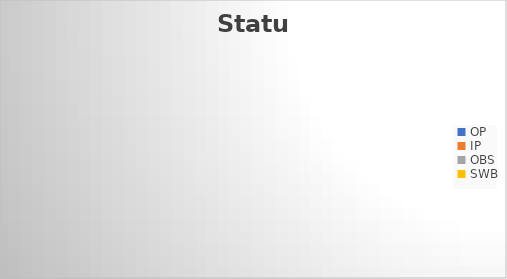
| Category | Status |
|---|---|
| OP | 0 |
| IP | 0 |
| OBS | 0 |
| SWB | 0 |